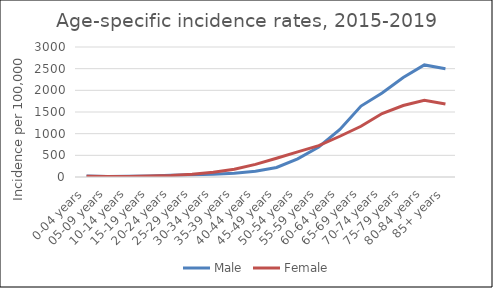
| Category | Male | Female |
|---|---|---|
| 0-04 years | 22.81 | 20.16 |
| 05-09 years | 13.16 | 13.66 |
| 10-14 years | 15.94 | 12.67 |
| 15-19 years | 25.38 | 23.77 |
| 20-24 years | 40.45 | 34.71 |
| 25-29 years | 49.33 | 61.41 |
| 30-34 years | 64.99 | 112.1 |
| 35-39 years | 89.02 | 178.85 |
| 40-44 years | 132.97 | 291.33 |
| 45-49 years | 219.8 | 433.55 |
| 50-54 years | 420.33 | 581.1 |
| 55-59 years | 692.76 | 724.7 |
| 60-64 years | 1097.53 | 940.37 |
| 65-69 years | 1636.95 | 1170.08 |
| 70-74 years | 1940.06 | 1464.01 |
| 75-79 years | 2296.87 | 1649.12 |
| 80-84 years | 2586.13 | 1768.82 |
| 85+ years | 2499.74 | 1683.39 |